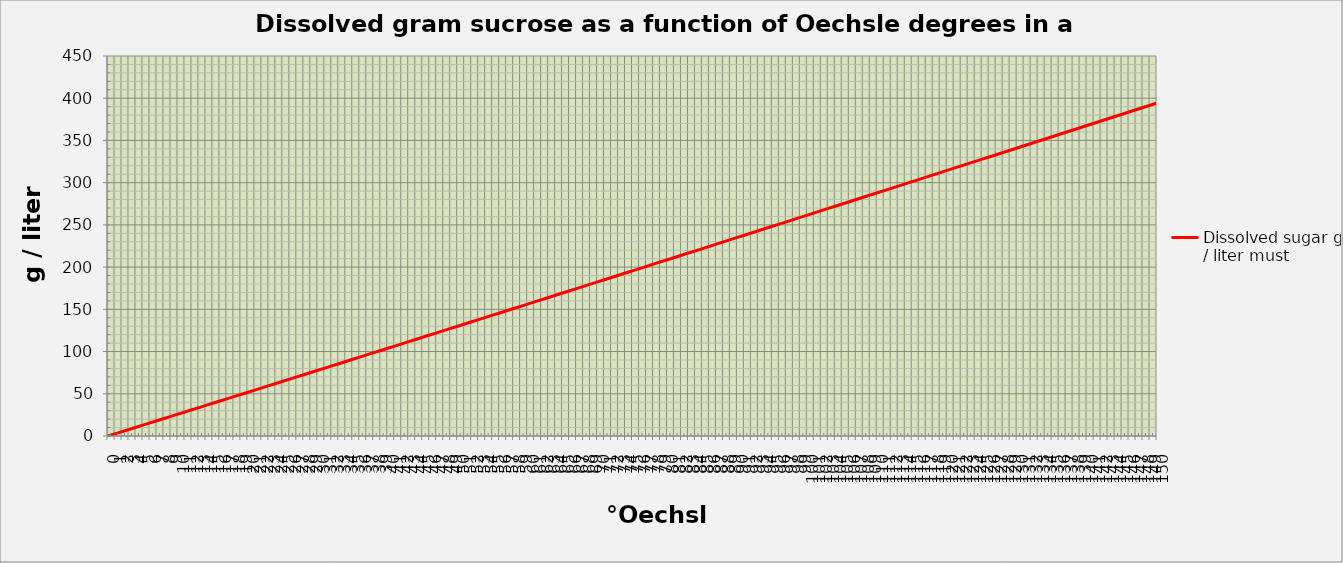
| Category | Dissolved sugar g / liter must |
|---|---|
| 0.0 | 0 |
| 1.0 | 2.583 |
| 2.0 | 5.166 |
| 3.0 | 7.75 |
| 4.0 | 10.335 |
| 5.0 | 12.921 |
| 6.0 | 15.508 |
| 7.0 | 18.095 |
| 8.0 | 20.683 |
| 9.0 | 23.272 |
| 10.0 | 25.861 |
| 11.0 | 28.452 |
| 12.0 | 31.043 |
| 13.0 | 33.634 |
| 14.0 | 36.227 |
| 15.0 | 38.82 |
| 16.0 | 41.414 |
| 17.0 | 44.009 |
| 18.0 | 46.604 |
| 19.0 | 49.2 |
| 20.0 | 51.797 |
| 21.0 | 54.394 |
| 22.0 | 56.993 |
| 23.0 | 59.591 |
| 24.0 | 62.191 |
| 25.0 | 64.791 |
| 26.0 | 67.392 |
| 27.0 | 69.994 |
| 28.0 | 72.596 |
| 29.0 | 75.199 |
| 30.0 | 77.803 |
| 31.0 | 80.407 |
| 32.0 | 83.012 |
| 33.0 | 85.618 |
| 34.0 | 88.224 |
| 35.0 | 90.831 |
| 36.0 | 93.438 |
| 37.0 | 96.047 |
| 38.0 | 98.656 |
| 39.0 | 101.265 |
| 40.0 | 103.875 |
| 41.0 | 106.486 |
| 42.0 | 109.097 |
| 43.0 | 111.709 |
| 44.0 | 114.322 |
| 45.0 | 116.935 |
| 46.0 | 119.549 |
| 47.0 | 122.164 |
| 48.0 | 124.779 |
| 49.0 | 127.395 |
| 50.0 | 130.011 |
| 51.0 | 132.628 |
| 52.0 | 135.245 |
| 53.0 | 137.863 |
| 54.0 | 140.482 |
| 55.0 | 143.101 |
| 56.0 | 145.721 |
| 57.0 | 148.342 |
| 58.0 | 150.963 |
| 59.0 | 153.585 |
| 60.0 | 156.207 |
| 61.0 | 158.83 |
| 62.0 | 161.453 |
| 63.0 | 164.077 |
| 64.0 | 166.701 |
| 65.0 | 169.327 |
| 66.0 | 171.952 |
| 67.0 | 174.578 |
| 68.0 | 177.205 |
| 69.0 | 179.833 |
| 70.0 | 182.46 |
| 71.0 | 185.089 |
| 72.0 | 187.718 |
| 73.0 | 190.347 |
| 74.0 | 192.977 |
| 75.0 | 195.608 |
| 76.0 | 198.239 |
| 77.0 | 200.871 |
| 78.0 | 203.503 |
| 79.0 | 206.136 |
| 80.0 | 208.769 |
| 81.0 | 211.403 |
| 82.0 | 214.038 |
| 83.0 | 216.673 |
| 84.0 | 219.308 |
| 85.0 | 221.944 |
| 86.0 | 224.58 |
| 87.0 | 227.217 |
| 88.0 | 229.855 |
| 89.0 | 232.493 |
| 90.0 | 235.132 |
| 91.0 | 237.771 |
| 92.0 | 240.41 |
| 93.0 | 243.05 |
| 94.0 | 245.691 |
| 95.0 | 248.332 |
| 96.0 | 250.974 |
| 97.0 | 253.616 |
| 98.0 | 256.259 |
| 99.0 | 258.902 |
| 100.0 | 261.546 |
| 101.0 | 264.19 |
| 102.0 | 266.835 |
| 103.0 | 269.48 |
| 104.0 | 272.125 |
| 105.0 | 274.772 |
| 106.0 | 277.418 |
| 107.0 | 280.066 |
| 108.0 | 282.713 |
| 109.0 | 285.361 |
| 110.0 | 288.01 |
| 111.0 | 290.659 |
| 112.0 | 293.309 |
| 113.0 | 295.959 |
| 114.0 | 298.61 |
| 115.0 | 301.261 |
| 116.0 | 303.913 |
| 117.0 | 306.565 |
| 118.0 | 309.217 |
| 119.0 | 311.87 |
| 120.0 | 314.524 |
| 121.0 | 317.178 |
| 122.0 | 319.833 |
| 123.0 | 322.488 |
| 124.0 | 325.143 |
| 125.0 | 327.799 |
| 126.0 | 330.456 |
| 127.0 | 333.113 |
| 128.0 | 335.771 |
| 129.0 | 338.429 |
| 130.0 | 341.087 |
| 131.0 | 343.746 |
| 132.0 | 346.405 |
| 133.0 | 349.065 |
| 134.0 | 351.726 |
| 135.0 | 354.387 |
| 136.0 | 357.048 |
| 137.0 | 359.71 |
| 138.0 | 362.372 |
| 139.0 | 365.035 |
| 140.0 | 367.699 |
| 141.0 | 370.363 |
| 142.0 | 373.027 |
| 143.0 | 375.692 |
| 144.0 | 378.357 |
| 145.0 | 381.023 |
| 146.0 | 383.689 |
| 147.0 | 386.356 |
| 148.0 | 389.023 |
| 149.0 | 391.691 |
| 150.0 | 394.359 |